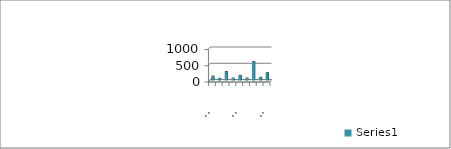
| Category | Series 0 |
|---|---|
| Kolka | 121 |
| Pūrciems | 54 |
| Roja | 264 |
| Kaltene | 65 |
| Mērsrags | 145 |
| Abragciems | 61 |
| Engure | 570 |
| Apšuciems | 87 |
| Lapmežciems | 230 |